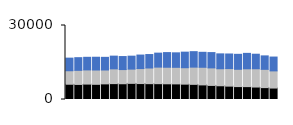
| Category | North Item1 | North Item2 | North Item3 |
|---|---|---|---|
| 0 | 6189 | 5469 | 5110 |
| 1 | 6109 | 5711 | 5139 |
| 2 | 6249 | 5747 | 5109 |
| 3 | 6155 | 5805 | 5172 |
| 4 | 6336 | 5629 | 5126 |
| 5 | 6440 | 5980 | 5161 |
| 6 | 6387 | 5745 | 5285 |
| 7 | 6539 | 5780 | 5249 |
| 8 | 6464 | 6073 | 5480 |
| 9 | 6422 | 6350 | 5457 |
| 10 | 6415 | 6710 | 5672 |
| 11 | 6366 | 6709 | 5944 |
| 12 | 6327 | 6717 | 5876 |
| 13 | 6223 | 6660 | 6311 |
| 14 | 6141 | 6979 | 6278 |
| 15 | 5919 | 7143 | 6069 |
| 16 | 5707 | 7109 | 6205 |
| 17 | 5571 | 6892 | 6039 |
| 18 | 5421 | 7108 | 5920 |
| 19 | 5235 | 7012 | 6067 |
| 20 | 5220 | 7222 | 6261 |
| 21 | 5050 | 7410 | 5897 |
| 22 | 4817 | 7412 | 5454 |
| 23 | 4644 | 6956 | 5609 |